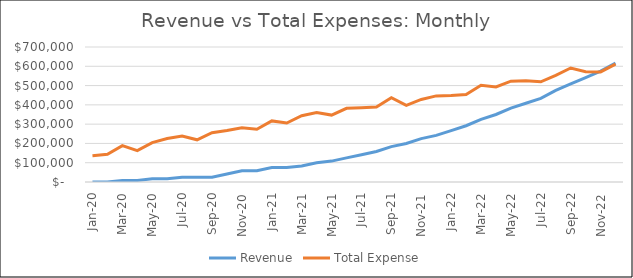
| Category | Revenue | Total Expense |
|---|---|---|
| 2020-01-01 | 0 | 136268.75 |
| 2020-02-29 | 0 | 143383.125 |
| 2020-03-31 | 8333.333 | 188373.125 |
| 2020-04-30 | 8333.333 | 162373.125 |
| 2020-05-31 | 16666.667 | 204436.875 |
| 2020-06-30 | 16666.667 | 225701.875 |
| 2020-07-31 | 25000 | 238296.25 |
| 2020-08-31 | 25000 | 218796.25 |
| 2020-09-30 | 25000 | 255342.5 |
| 2020-10-31 | 41666.667 | 267430 |
| 2020-11-30 | 58333.333 | 281773.75 |
| 2020-12-31 | 58333.333 | 273773.75 |
| 2021-01-31 | 75000 | 316766.812 |
| 2021-02-28 | 75000 | 305901.244 |
| 2021-03-31 | 83333.333 | 343889.694 |
| 2021-04-30 | 100000 | 359705.319 |
| 2021-05-31 | 108333.333 | 346926.981 |
| 2021-06-30 | 125000 | 382282.931 |
| 2021-07-31 | 141666.667 | 385344.763 |
| 2021-08-31 | 158333.333 | 388891.013 |
| 2021-09-30 | 183333.333 | 437144.9 |
| 2021-10-31 | 200000 | 397441.525 |
| 2021-11-30 | 225000 | 428188.588 |
| 2021-12-31 | 241666.667 | 446532.338 |
| 2022-01-31 | 266666.667 | 448388.288 |
| 2022-02-28 | 291666.667 | 453450.387 |
| 2022-03-31 | 325000 | 501185.862 |
| 2022-04-30 | 350000 | 493207.081 |
| 2022-05-31 | 383333.333 | 522882.794 |
| 2022-06-30 | 408333.333 | 525382.794 |
| 2022-07-31 | 433333.333 | 519389.656 |
| 2022-08-31 | 475000 | 553207.294 |
| 2022-09-30 | 508333.333 | 591271.181 |
| 2022-10-31 | 541666.667 | 571403.681 |
| 2022-11-30 | 575000 | 570670.644 |
| 2022-12-31 | 616666.667 | 611318.956 |